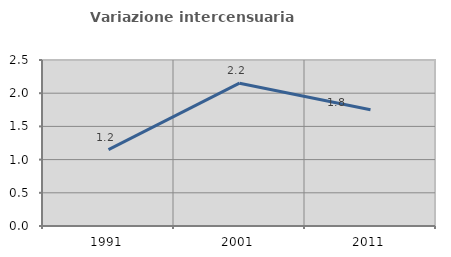
| Category | Variazione intercensuaria annua |
|---|---|
| 1991.0 | 1.15 |
| 2001.0 | 2.151 |
| 2011.0 | 1.75 |